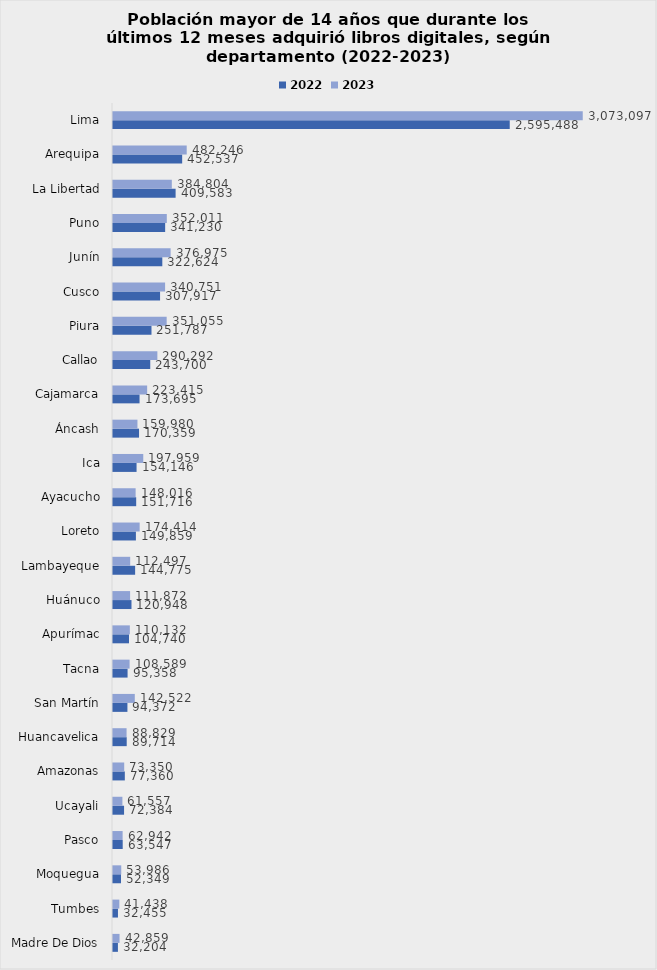
| Category | 2022 | 2023 |
|---|---|---|
| Madre De Dios | 32204 | 42859 |
| Tumbes | 32455 | 41438 |
| Moquegua | 52349 | 53986 |
| Pasco | 63547 | 62942 |
| Ucayali | 72384 | 61557 |
| Amazonas | 77360 | 73350 |
| Huancavelica | 89714 | 88829 |
| San Martín | 94372 | 142522 |
| Tacna | 95358 | 108589 |
| Apurímac | 104740 | 110132 |
| Huánuco | 120948 | 111872 |
| Lambayeque | 144775 | 112497 |
| Loreto | 149859 | 174414 |
| Ayacucho | 151716 | 148016 |
| Ica | 154146 | 197959 |
| Áncash | 170359 | 159980 |
| Cajamarca | 173695 | 223415 |
| Callao | 243700 | 290292 |
| Piura | 251787 | 351055 |
| Cusco | 307917 | 340751 |
| Junín | 322624 | 376975 |
| Puno | 341230 | 352011 |
| La Libertad | 409583 | 384804 |
| Arequipa | 452537 | 482246 |
| Lima | 2595488 | 3073097 |